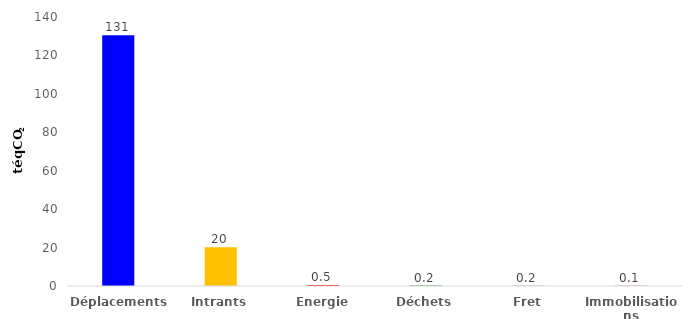
| Category | Series 0 |
|---|---|
| Déplacements | 130.514 |
| Intrants | 20.204 |
| Energie | 0.46 |
| Déchets | 0.218 |
| Fret | 0.168 |
| Immobilisations | 0.078 |